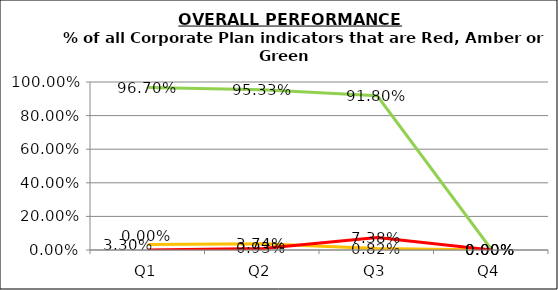
| Category | Green | Amber | Red |
|---|---|---|---|
| Q1 | 0.967 | 0.033 | 0 |
| Q2 | 0.953 | 0.037 | 0.009 |
| Q3 | 0.918 | 0.008 | 0.074 |
| Q4 | 0 | 0 | 0 |